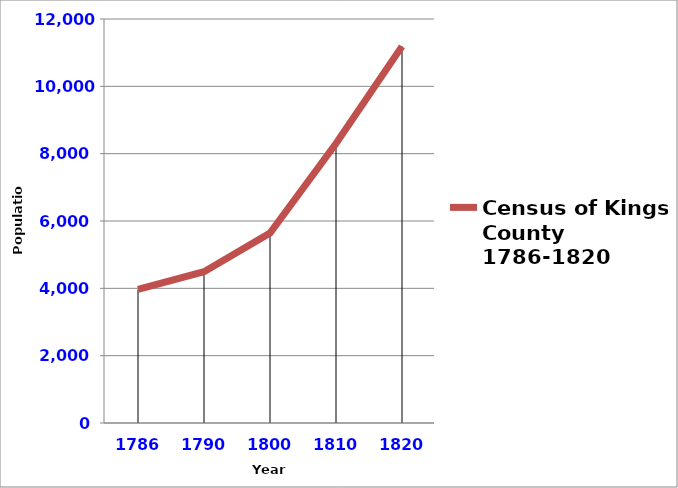
| Category | Census of Kings County 1786-1820 |
|---|---|
| 1786.0 | 3966 |
| 1790.0 | 4494 |
| 1800.0 | 5640 |
| 1810.0 | 8303 |
| 1820.0 | 11187 |